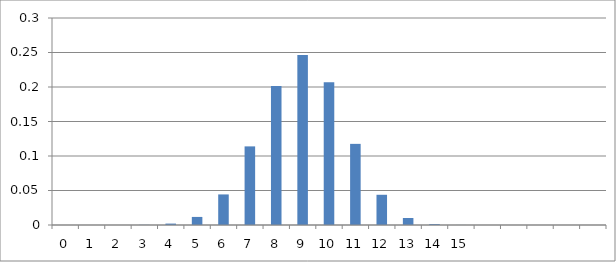
| Category | Series 0 |
|---|---|
| 0 | 0 |
| 1 | 0 |
| 2 | 0 |
| 3 | 0 |
| 4 | 0.002 |
| 5 | 0.012 |
| 6 | 0.044 |
| 7 | 0.114 |
| 8 | 0.202 |
| 9 | 0.246 |
| 10 | 0.207 |
| 11 | 0.118 |
| 12 | 0.044 |
| 13 | 0.01 |
| 14 | 0.001 |
| 15 | 0 |